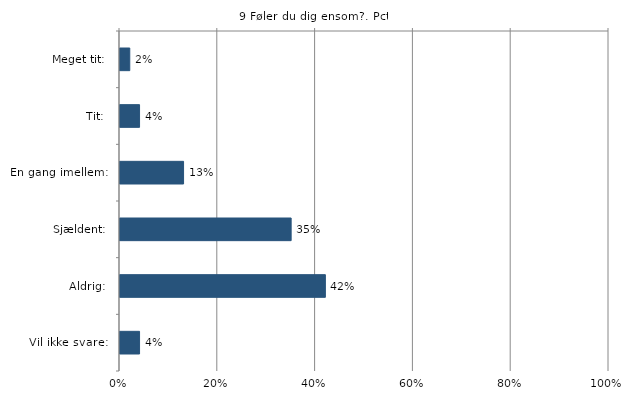
| Category | Føler du dig ensom? |
|---|---|
| Meget tit:  | 0.02 |
| Tit:  | 0.04 |
| En gang imellem:  | 0.13 |
| Sjældent:  | 0.35 |
| Aldrig:  | 0.42 |
| Vil ikke svare:  | 0.04 |